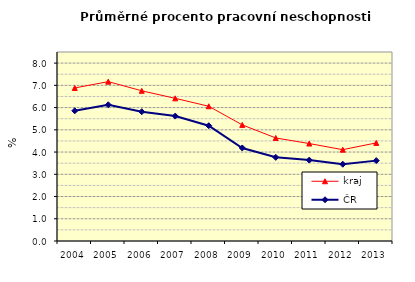
| Category | kraj | ČR |
|---|---|---|
| 2004.0 | 6.883 | 5.857 |
| 2005.0 | 7.168 | 6.126 |
| 2006.0 | 6.755 | 5.814 |
| 2007.0 | 6.415 | 5.619 |
| 2008.0 | 6.059 | 5.184 |
| 2009.0 | 5.222 | 4.184 |
| 2010.0 | 4.634 | 3.763 |
| 2011.0 | 4.383 | 3.638 |
| 2012.0 | 4.108 | 3.452 |
| 2013.0 | 4.412 | 3.615 |